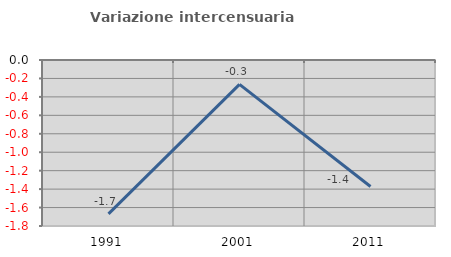
| Category | Variazione intercensuaria annua |
|---|---|
| 1991.0 | -1.669 |
| 2001.0 | -0.265 |
| 2011.0 | -1.372 |